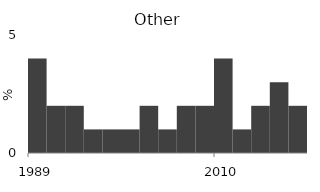
| Category | Other |
|---|---|
| 1989.0 | 4 |
| 1992.0 | 2 |
| 1994.0 | 2 |
| 1996.0 | 1 |
| 1998.0 | 1 |
| 2000.0 | 1 |
| 2002.0 | 2 |
| 2004.0 | 1 |
| 2006.0 | 2 |
| 2008.0 | 2 |
| 2010.0 | 4 |
| 2012.0 | 1 |
| 2014.0 | 2 |
| 2015.0 | 3 |
| 2016.0 | 2 |